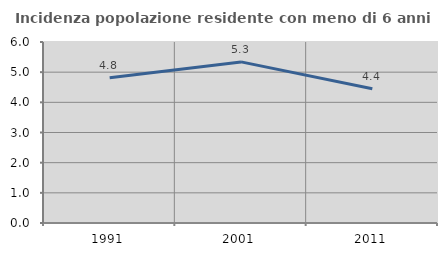
| Category | Incidenza popolazione residente con meno di 6 anni |
|---|---|
| 1991.0 | 4.814 |
| 2001.0 | 5.34 |
| 2011.0 | 4.448 |